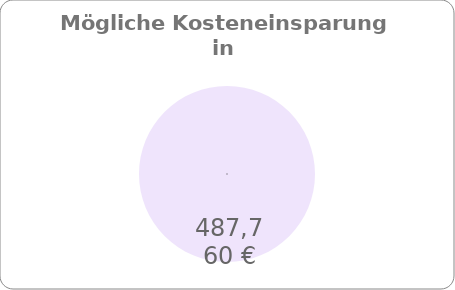
| Category | Series 0 |
|---|---|
| 0 | 487760 |